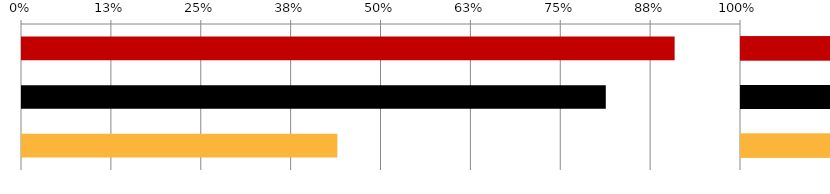
| Category | Series 6 | Series 7 | Series 8 | Series 9 | Series 10 | Series 11 | Series 0 | Series 1 | Series 4 | Series 5 | Series 2 | Series 3 |
|---|---|---|---|---|---|---|---|---|---|---|---|---|
| 0 | 0.909 | 0.091 | 0.909 | 0.091 | 0.909 | 0.091 | 0.909 | 0.091 | 0.909 | 0.091 | 0.909 | 0.091 |
| 1 | 0.813 | 0.187 | 0.813 | 0.187 | 0.813 | 0.187 | 0.813 | 0.187 | 0.813 | 0.187 | 0.813 | 0.187 |
| 2 | 0.44 | 0.56 | 0.44 | 0.56 | 0.44 | 0.56 | 0.44 | 0.56 | 0.44 | 0.56 | 0.44 | 0.56 |